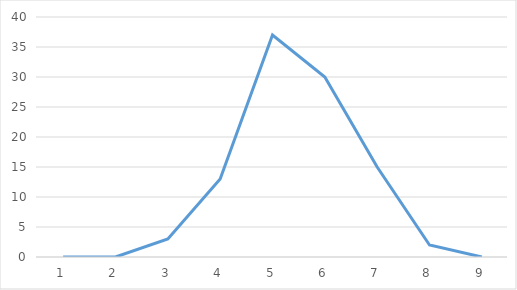
| Category | Series 0 |
|---|---|
| 0 | 0 |
| 1 | 0 |
| 2 | 3 |
| 3 | 13 |
| 4 | 37 |
| 5 | 30 |
| 6 | 15 |
| 7 | 2 |
| 8 | 0 |